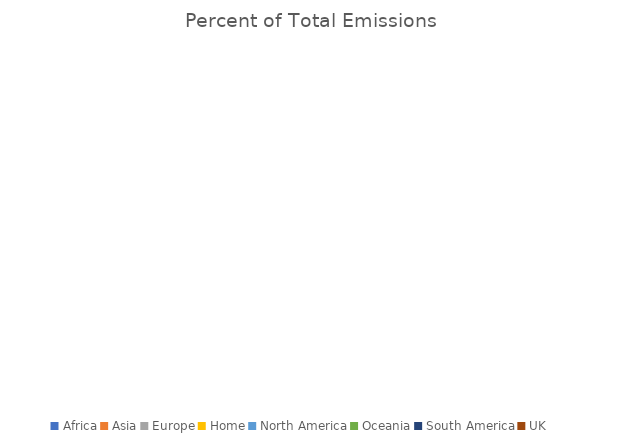
| Category | Percent of Total Emissions  |
|---|---|
| Africa | 0 |
| Asia | 0 |
| Europe | 0 |
| Home | 0 |
| North America | 0 |
| Oceania | 0 |
| South America | 0 |
| UK | 0 |